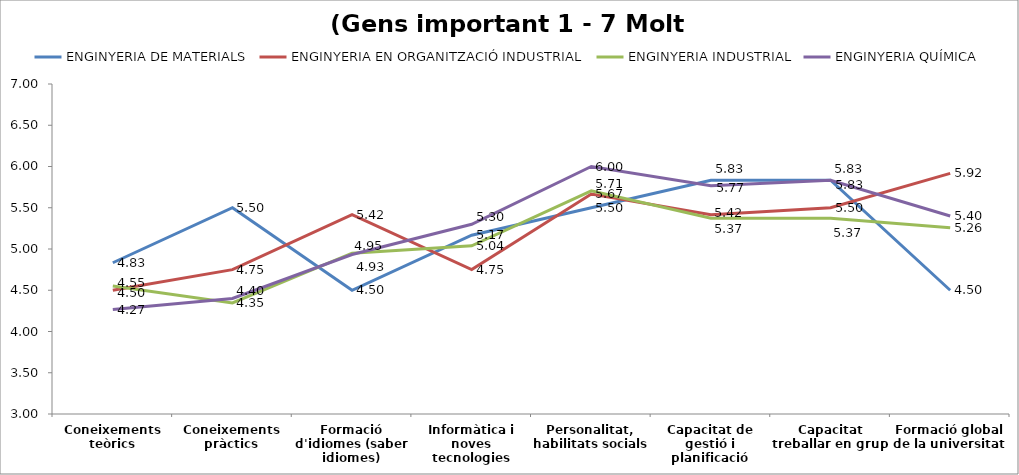
| Category | ENGINYERIA DE MATERIALS | ENGINYERIA EN ORGANITZACIÓ INDUSTRIAL | ENGINYERIA INDUSTRIAL | ENGINYERIA QUÍMICA |
|---|---|---|---|---|
| Coneixements teòrics | 4.833 | 4.5 | 4.551 | 4.267 |
| Coneixements pràctics | 5.5 | 4.75 | 4.346 | 4.4 |
| Formació d'idiomes (saber idiomes) | 4.5 | 5.417 | 4.949 | 4.933 |
| Informàtica i noves tecnologies | 5.167 | 4.75 | 5.038 | 5.3 |
| Personalitat, habilitats socials | 5.5 | 5.667 | 5.705 | 6 |
| Capacitat de gestió i planificació | 5.833 | 5.417 | 5.372 | 5.767 |
| Capacitat treballar en grup | 5.833 | 5.5 | 5.372 | 5.833 |
| Formació global de la universitat | 4.5 | 5.917 | 5.256 | 5.4 |